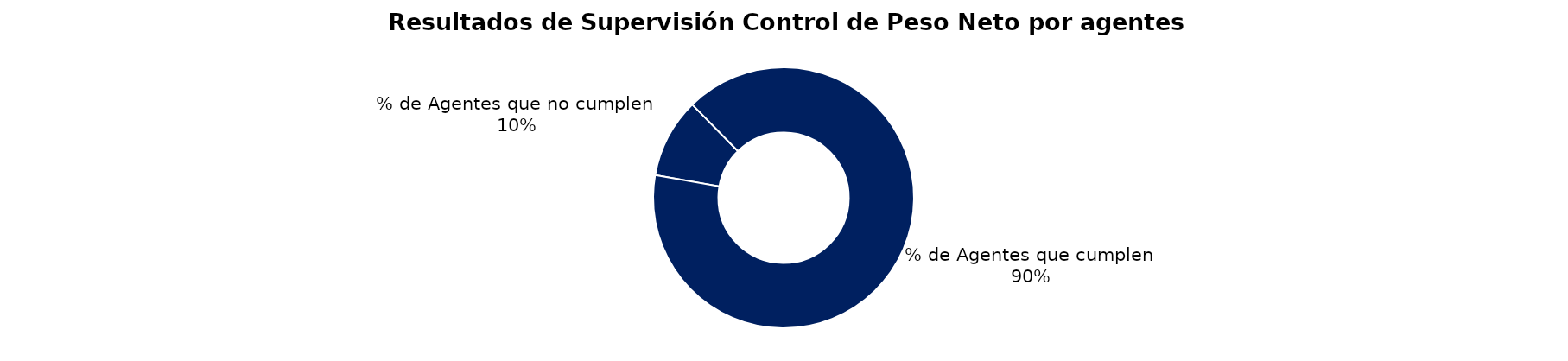
| Category | Series 0 |
|---|---|
| % de Agentes que no cumplen | 9 |
| % de Agentes que cumplen | 82 |